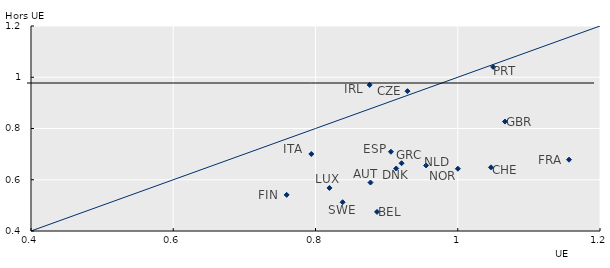
| Category | Series 0 |
|---|---|
| 0.8773171 | 0.589 |
| 0.8865164 | 0.475 |
| 1.046744 | 0.648 |
| 0.9293441 | 0.946 |
| 0.9134672 | 0.644 |
| 0.9060752 | 0.709 |
| 0.759416 | 0.541 |
| 1.156406 | 0.678 |
| 1.066405 | 0.827 |
| 0.9210072 | 0.664 |
| 0.8761416 | 0.97 |
| 0.794109 | 0.701 |
| 0.8196253 | 0.568 |
| 0.9554867 | 0.656 |
| 1.000178 | 0.643 |
| 1.04976 | 1.04 |
| 0.8381473 | 0.512 |